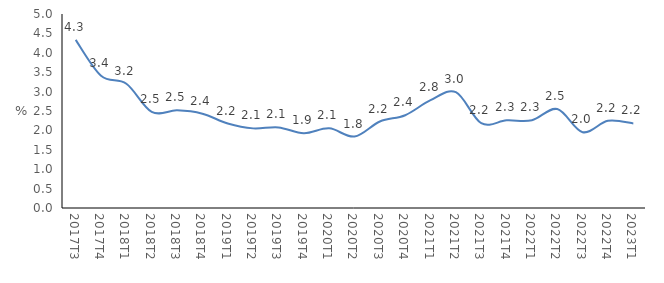
| Category | 2017Τ3 |
|---|---|
| 2017Τ3 | 4.333 |
| 2017Τ4 | 3.409 |
| 2018Τ1 | 3.202 |
| 2018Τ2 | 2.477 |
| 2018Τ3 | 2.517 |
| 2018Τ4 | 2.43 |
| 2019Τ1 | 2.177 |
| 2019Τ2 | 2.052 |
| 2019Τ3 | 2.078 |
| 2019Τ4 | 1.927 |
| 2020Τ1 | 2.052 |
| 2020Τ2 | 1.842 |
| 2020Τ3 | 2.229 |
| 2020Τ4 | 2.392 |
| 2021Τ1 | 2.778 |
| 2021Τ2 | 2.985 |
| 2021Τ3 | 2.185 |
| 2021Τ4 | 2.259 |
| 2022Τ1 | 2.263 |
| 2022Τ2 | 2.55 |
| 2022Τ3 | 1.954 |
| 2022Τ4 | 2.249 |
| 2023Τ1 | 2.181 |